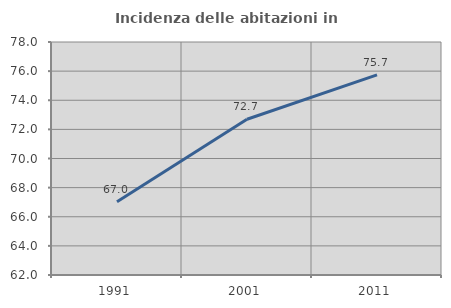
| Category | Incidenza delle abitazioni in proprietà  |
|---|---|
| 1991.0 | 67.033 |
| 2001.0 | 72.697 |
| 2011.0 | 75.74 |